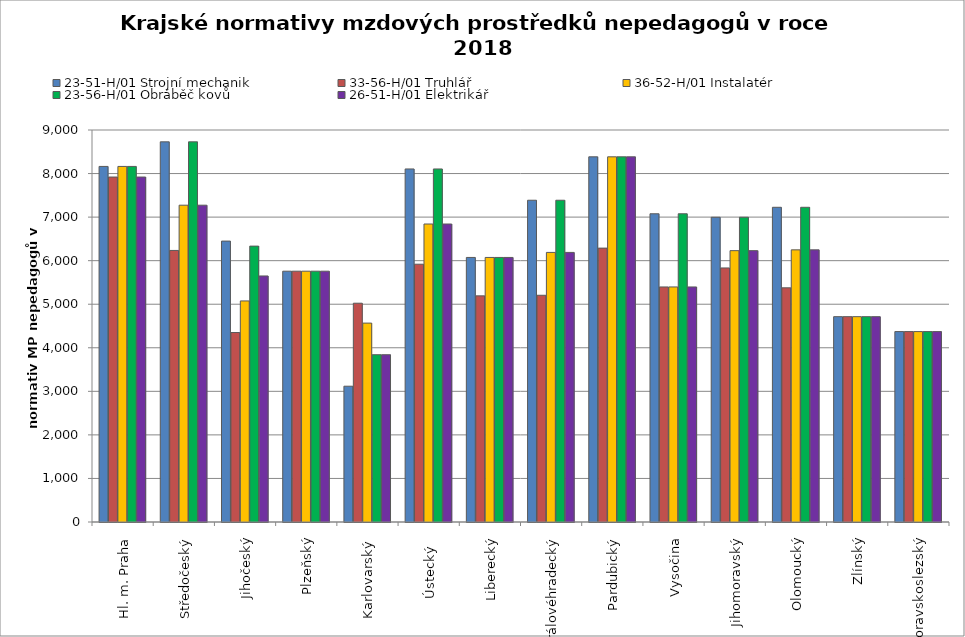
| Category | 23-51-H/01 Strojní mechanik | 33-56-H/01 Truhlář | 36-52-H/01 Instalatér | 23-56-H/01 Obráběč kovů | 26-51-H/01 Elektrikář |
|---|---|---|---|---|---|
| Hl. m. Praha | 8163.692 | 7920 | 8163.692 | 8163.692 | 7920 |
| Středočeský | 8728.4 | 6234.571 | 7273.667 | 8728.4 | 7273.667 |
| Jihočeský | 6449.487 | 4350.268 | 5075.486 | 6334.146 | 5648.873 |
| Plzeňský | 5758.269 | 5758.269 | 5758.269 | 5758.269 | 5758.269 |
| Karlovarský  | 3117.783 | 5023.256 | 4566.596 | 3840.683 | 3840.683 |
| Ústecký   | 8105.6 | 5918.554 | 6841.543 | 8105.6 | 6841.543 |
| Liberecký | 6073.902 | 5191.705 | 6073.902 | 6073.902 | 6073.902 |
| Královéhradecký | 7387.163 | 5205.427 | 6189.406 | 7387.163 | 6189.406 |
| Pardubický | 8384.4 | 6288.3 | 8384.4 | 8384.4 | 8384.4 |
| Vysočina | 7076.728 | 5396.518 | 5396.518 | 7076.728 | 5396.518 |
| Jihomoravský | 6996.509 | 5832.848 | 6230.052 | 6996.509 | 6230.052 |
| Olomoucký | 7225.373 | 5376.4 | 6248.131 | 7225.373 | 6248.131 |
| Zlínský | 4714.286 | 4714.286 | 4714.286 | 4714.286 | 4714.286 |
| Moravskoslezský | 4371.904 | 4371.904 | 4371.904 | 4371.904 | 4371.904 |